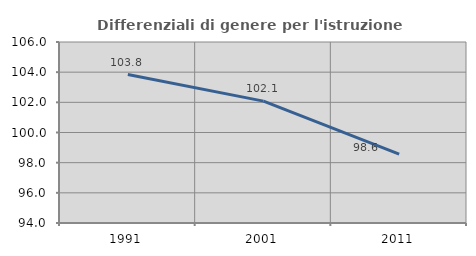
| Category | Differenziali di genere per l'istruzione superiore |
|---|---|
| 1991.0 | 103.843 |
| 2001.0 | 102.08 |
| 2011.0 | 98.564 |